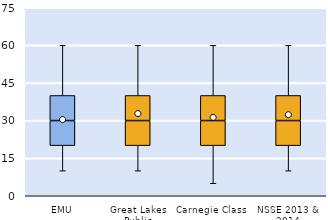
| Category | 25th | 50th | 75th |
|---|---|---|---|
| EMU | 20 | 10 | 10 |
| Great Lakes Public | 20 | 10 | 10 |
| Carnegie Class | 20 | 10 | 10 |
| NSSE 2013 & 2014 | 20 | 10 | 10 |